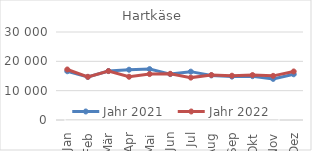
| Category | Jahr 2021 | Jahr 2022 |
|---|---|---|
| Jan | 16624.277 | 17219.363 |
| Feb | 14677.942 | 14719.256 |
| Mär | 16691.726 | 16685.773 |
| Apr | 17139.435 | 14741.311 |
| Mai | 17344.114 | 15655.714 |
| Jun | 15647.775 | 15745.173 |
| Jul | 16483.471 | 14451.356 |
| Aug | 15208.586 | 15327.707 |
| Sep | 14795.782 | 15102.48 |
| Okt | 14947.237 | 15321.749 |
| Nov | 14018.272 | 15049.603 |
| Dez | 15593.131 | 16545.429 |